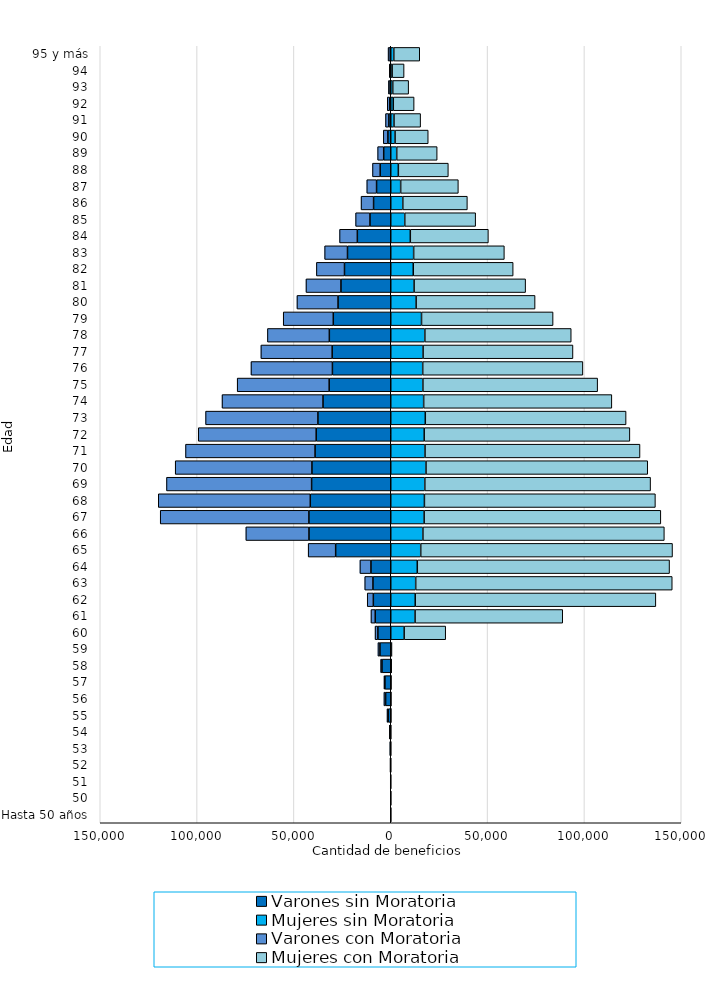
| Category | Varones sin Moratoria | Mujeres sin Moratoria | Varones con Moratoria | Mujeres con Moratoria |
|---|---|---|---|---|
| Hasta 50 años | -79 | 39 | -6 | 9 |
| 50 | -56 | 26 | -3 | 3 |
| 51 | -130 | 46 | -10 | 5 |
| 52 | -251 | 53 | -16 | 12 |
| 53 | -339 | 74 | -17 | 12 |
| 54 | -553 | 84 | -109 | 19 |
| 55 | -1330 | 139 | -587 | 33 |
| 56 | -2639 | 159 | -879 | 58 |
| 57 | -3015 | 195 | -477 | 82 |
| 58 | -4540 | 297 | -683 | 106 |
| 59 | -5587 | 404 | -1013 | 194 |
| 60 | -6645 | 6924 | -1454 | 21455 |
| 61 | -8016 | 12556 | -2193 | 76253 |
| 62 | -8988 | 12638 | -3162 | 124249 |
| 63 | -9193 | 12881 | -4227 | 132464 |
| 64 | -10229 | 13703 | -5689 | 130260 |
| 65 | -28444 | 15481 | -14188 | 130017 |
| 66 | -42235 | 16606 | -32572 | 124663 |
| 67 | -42265 | 17246 | -76766 | 122214 |
| 68 | -41543 | 17386 | -78506 | 119263 |
| 69 | -40859 | 17591 | -74934 | 116578 |
| 70 | -40703 | 18208 | -70588 | 114488 |
| 71 | -39097 | 17701 | -66871 | 111000 |
| 72 | -38515 | 17270 | -60870 | 106209 |
| 73 | -37611 | 17834 | -58002 | 103682 |
| 74 | -34984 | 16995 | -52130 | 97168 |
| 75 | -31812 | 16599 | -47473 | 90237 |
| 76 | -30125 | 16500 | -42039 | 82717 |
| 77 | -30259 | 16695 | -36792 | 77397 |
| 78 | -31714 | 17605 | -31963 | 75584 |
| 79 | -29666 | 15888 | -25852 | 67936 |
| 80 | -27224 | 13107 | -21208 | 61420 |
| 81 | -25716 | 12060 | -18050 | 57575 |
| 82 | -23886 | 11623 | -14506 | 51586 |
| 83 | -22336 | 11820 | -11793 | 46840 |
| 84 | -17251 | 10100 | -9177 | 40315 |
| 85 | -10734 | 7230 | -7404 | 36615 |
| 86 | -8864 | 6224 | -6464 | 33339 |
| 87 | -7324 | 5116 | -5041 | 29789 |
| 88 | -5470 | 3915 | -3949 | 25818 |
| 89 | -3637 | 3074 | -3128 | 20890 |
| 90 | -1480 | 2231 | -2355 | 17119 |
| 91 | -984 | 1675 | -1714 | 13743 |
| 92 | -543 | 1307 | -1257 | 10760 |
| 93 | -363 | 1038 | -832 | 8204 |
| 94 | -184 | 717 | -570 | 6170 |
| 95 y más | -266 | 1580 | -1099 | 13396 |